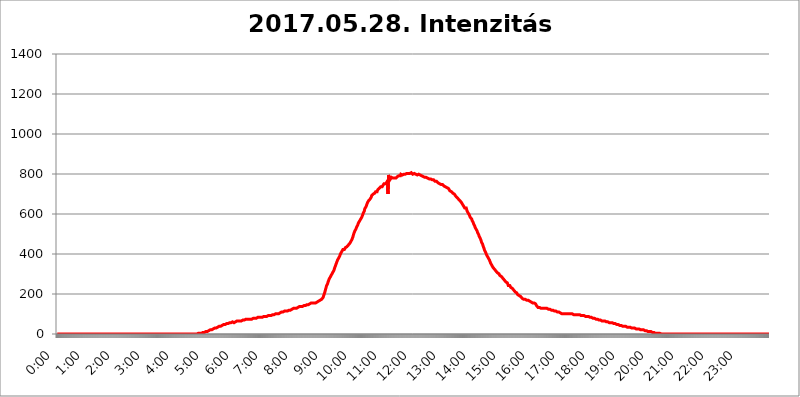
| Category | 2017.05.28. Intenzitás [W/m^2] |
|---|---|
| 0.0 | 0 |
| 0.0006944444444444445 | 0 |
| 0.001388888888888889 | 0 |
| 0.0020833333333333333 | 0 |
| 0.002777777777777778 | 0 |
| 0.003472222222222222 | 0 |
| 0.004166666666666667 | 0 |
| 0.004861111111111111 | 0 |
| 0.005555555555555556 | 0 |
| 0.0062499999999999995 | 0 |
| 0.006944444444444444 | 0 |
| 0.007638888888888889 | 0 |
| 0.008333333333333333 | 0 |
| 0.009027777777777779 | 0 |
| 0.009722222222222222 | 0 |
| 0.010416666666666666 | 0 |
| 0.011111111111111112 | 0 |
| 0.011805555555555555 | 0 |
| 0.012499999999999999 | 0 |
| 0.013194444444444444 | 0 |
| 0.013888888888888888 | 0 |
| 0.014583333333333332 | 0 |
| 0.015277777777777777 | 0 |
| 0.015972222222222224 | 0 |
| 0.016666666666666666 | 0 |
| 0.017361111111111112 | 0 |
| 0.018055555555555557 | 0 |
| 0.01875 | 0 |
| 0.019444444444444445 | 0 |
| 0.02013888888888889 | 0 |
| 0.020833333333333332 | 0 |
| 0.02152777777777778 | 0 |
| 0.022222222222222223 | 0 |
| 0.02291666666666667 | 0 |
| 0.02361111111111111 | 0 |
| 0.024305555555555556 | 0 |
| 0.024999999999999998 | 0 |
| 0.025694444444444447 | 0 |
| 0.02638888888888889 | 0 |
| 0.027083333333333334 | 0 |
| 0.027777777777777776 | 0 |
| 0.02847222222222222 | 0 |
| 0.029166666666666664 | 0 |
| 0.029861111111111113 | 0 |
| 0.030555555555555555 | 0 |
| 0.03125 | 0 |
| 0.03194444444444445 | 0 |
| 0.03263888888888889 | 0 |
| 0.03333333333333333 | 0 |
| 0.034027777777777775 | 0 |
| 0.034722222222222224 | 0 |
| 0.035416666666666666 | 0 |
| 0.036111111111111115 | 0 |
| 0.03680555555555556 | 0 |
| 0.0375 | 0 |
| 0.03819444444444444 | 0 |
| 0.03888888888888889 | 0 |
| 0.03958333333333333 | 0 |
| 0.04027777777777778 | 0 |
| 0.04097222222222222 | 0 |
| 0.041666666666666664 | 0 |
| 0.042361111111111106 | 0 |
| 0.04305555555555556 | 0 |
| 0.043750000000000004 | 0 |
| 0.044444444444444446 | 0 |
| 0.04513888888888889 | 0 |
| 0.04583333333333334 | 0 |
| 0.04652777777777778 | 0 |
| 0.04722222222222222 | 0 |
| 0.04791666666666666 | 0 |
| 0.04861111111111111 | 0 |
| 0.049305555555555554 | 0 |
| 0.049999999999999996 | 0 |
| 0.05069444444444445 | 0 |
| 0.051388888888888894 | 0 |
| 0.052083333333333336 | 0 |
| 0.05277777777777778 | 0 |
| 0.05347222222222222 | 0 |
| 0.05416666666666667 | 0 |
| 0.05486111111111111 | 0 |
| 0.05555555555555555 | 0 |
| 0.05625 | 0 |
| 0.05694444444444444 | 0 |
| 0.057638888888888885 | 0 |
| 0.05833333333333333 | 0 |
| 0.05902777777777778 | 0 |
| 0.059722222222222225 | 0 |
| 0.06041666666666667 | 0 |
| 0.061111111111111116 | 0 |
| 0.06180555555555556 | 0 |
| 0.0625 | 0 |
| 0.06319444444444444 | 0 |
| 0.06388888888888888 | 0 |
| 0.06458333333333334 | 0 |
| 0.06527777777777778 | 0 |
| 0.06597222222222222 | 0 |
| 0.06666666666666667 | 0 |
| 0.06736111111111111 | 0 |
| 0.06805555555555555 | 0 |
| 0.06874999999999999 | 0 |
| 0.06944444444444443 | 0 |
| 0.07013888888888889 | 0 |
| 0.07083333333333333 | 0 |
| 0.07152777777777779 | 0 |
| 0.07222222222222223 | 0 |
| 0.07291666666666667 | 0 |
| 0.07361111111111111 | 0 |
| 0.07430555555555556 | 0 |
| 0.075 | 0 |
| 0.07569444444444444 | 0 |
| 0.0763888888888889 | 0 |
| 0.07708333333333334 | 0 |
| 0.07777777777777778 | 0 |
| 0.07847222222222222 | 0 |
| 0.07916666666666666 | 0 |
| 0.0798611111111111 | 0 |
| 0.08055555555555556 | 0 |
| 0.08125 | 0 |
| 0.08194444444444444 | 0 |
| 0.08263888888888889 | 0 |
| 0.08333333333333333 | 0 |
| 0.08402777777777777 | 0 |
| 0.08472222222222221 | 0 |
| 0.08541666666666665 | 0 |
| 0.08611111111111112 | 0 |
| 0.08680555555555557 | 0 |
| 0.08750000000000001 | 0 |
| 0.08819444444444445 | 0 |
| 0.08888888888888889 | 0 |
| 0.08958333333333333 | 0 |
| 0.09027777777777778 | 0 |
| 0.09097222222222222 | 0 |
| 0.09166666666666667 | 0 |
| 0.09236111111111112 | 0 |
| 0.09305555555555556 | 0 |
| 0.09375 | 0 |
| 0.09444444444444444 | 0 |
| 0.09513888888888888 | 0 |
| 0.09583333333333333 | 0 |
| 0.09652777777777777 | 0 |
| 0.09722222222222222 | 0 |
| 0.09791666666666667 | 0 |
| 0.09861111111111111 | 0 |
| 0.09930555555555555 | 0 |
| 0.09999999999999999 | 0 |
| 0.10069444444444443 | 0 |
| 0.1013888888888889 | 0 |
| 0.10208333333333335 | 0 |
| 0.10277777777777779 | 0 |
| 0.10347222222222223 | 0 |
| 0.10416666666666667 | 0 |
| 0.10486111111111111 | 0 |
| 0.10555555555555556 | 0 |
| 0.10625 | 0 |
| 0.10694444444444444 | 0 |
| 0.1076388888888889 | 0 |
| 0.10833333333333334 | 0 |
| 0.10902777777777778 | 0 |
| 0.10972222222222222 | 0 |
| 0.1111111111111111 | 0 |
| 0.11180555555555556 | 0 |
| 0.11180555555555556 | 0 |
| 0.1125 | 0 |
| 0.11319444444444444 | 0 |
| 0.11388888888888889 | 0 |
| 0.11458333333333333 | 0 |
| 0.11527777777777777 | 0 |
| 0.11597222222222221 | 0 |
| 0.11666666666666665 | 0 |
| 0.1173611111111111 | 0 |
| 0.11805555555555557 | 0 |
| 0.11944444444444445 | 0 |
| 0.12013888888888889 | 0 |
| 0.12083333333333333 | 0 |
| 0.12152777777777778 | 0 |
| 0.12222222222222223 | 0 |
| 0.12291666666666667 | 0 |
| 0.12291666666666667 | 0 |
| 0.12361111111111112 | 0 |
| 0.12430555555555556 | 0 |
| 0.125 | 0 |
| 0.12569444444444444 | 0 |
| 0.12638888888888888 | 0 |
| 0.12708333333333333 | 0 |
| 0.16875 | 0 |
| 0.12847222222222224 | 0 |
| 0.12916666666666668 | 0 |
| 0.12986111111111112 | 0 |
| 0.13055555555555556 | 0 |
| 0.13125 | 0 |
| 0.13194444444444445 | 0 |
| 0.1326388888888889 | 0 |
| 0.13333333333333333 | 0 |
| 0.13402777777777777 | 0 |
| 0.13402777777777777 | 0 |
| 0.13472222222222222 | 0 |
| 0.13541666666666666 | 0 |
| 0.1361111111111111 | 0 |
| 0.13749999999999998 | 0 |
| 0.13819444444444443 | 0 |
| 0.1388888888888889 | 0 |
| 0.13958333333333334 | 0 |
| 0.14027777777777778 | 0 |
| 0.14097222222222222 | 0 |
| 0.14166666666666666 | 0 |
| 0.1423611111111111 | 0 |
| 0.14305555555555557 | 0 |
| 0.14375000000000002 | 0 |
| 0.14444444444444446 | 0 |
| 0.1451388888888889 | 0 |
| 0.1451388888888889 | 0 |
| 0.14652777777777778 | 0 |
| 0.14722222222222223 | 0 |
| 0.14791666666666667 | 0 |
| 0.1486111111111111 | 0 |
| 0.14930555555555555 | 0 |
| 0.15 | 0 |
| 0.15069444444444444 | 0 |
| 0.15138888888888888 | 0 |
| 0.15208333333333332 | 0 |
| 0.15277777777777776 | 0 |
| 0.15347222222222223 | 0 |
| 0.15416666666666667 | 0 |
| 0.15486111111111112 | 0 |
| 0.15555555555555556 | 0 |
| 0.15625 | 0 |
| 0.15694444444444444 | 0 |
| 0.15763888888888888 | 0 |
| 0.15833333333333333 | 0 |
| 0.15902777777777777 | 0 |
| 0.15972222222222224 | 0 |
| 0.16041666666666668 | 0 |
| 0.16111111111111112 | 0 |
| 0.16180555555555556 | 0 |
| 0.1625 | 0 |
| 0.16319444444444445 | 0 |
| 0.1638888888888889 | 0 |
| 0.16458333333333333 | 0 |
| 0.16527777777777777 | 0 |
| 0.16597222222222222 | 0 |
| 0.16666666666666666 | 0 |
| 0.1673611111111111 | 0 |
| 0.16805555555555554 | 0 |
| 0.16874999999999998 | 0 |
| 0.16944444444444443 | 0 |
| 0.17013888888888887 | 0 |
| 0.1708333333333333 | 0 |
| 0.17152777777777775 | 0 |
| 0.17222222222222225 | 0 |
| 0.1729166666666667 | 0 |
| 0.17361111111111113 | 0 |
| 0.17430555555555557 | 0 |
| 0.17500000000000002 | 0 |
| 0.17569444444444446 | 0 |
| 0.1763888888888889 | 0 |
| 0.17708333333333334 | 0 |
| 0.17777777777777778 | 0 |
| 0.17847222222222223 | 0 |
| 0.17916666666666667 | 0 |
| 0.1798611111111111 | 0 |
| 0.18055555555555555 | 0 |
| 0.18125 | 0 |
| 0.18194444444444444 | 0 |
| 0.1826388888888889 | 0 |
| 0.18333333333333335 | 0 |
| 0.1840277777777778 | 0 |
| 0.18472222222222223 | 0 |
| 0.18541666666666667 | 0 |
| 0.18611111111111112 | 0 |
| 0.18680555555555556 | 0 |
| 0.1875 | 0 |
| 0.18819444444444444 | 0 |
| 0.18888888888888888 | 0 |
| 0.18958333333333333 | 0 |
| 0.19027777777777777 | 0 |
| 0.1909722222222222 | 0 |
| 0.19166666666666665 | 0 |
| 0.19236111111111112 | 0 |
| 0.19305555555555554 | 0 |
| 0.19375 | 0 |
| 0.19444444444444445 | 0 |
| 0.1951388888888889 | 0 |
| 0.19583333333333333 | 0 |
| 0.19652777777777777 | 0 |
| 0.19722222222222222 | 3.525 |
| 0.19791666666666666 | 3.525 |
| 0.1986111111111111 | 3.525 |
| 0.19930555555555554 | 3.525 |
| 0.19999999999999998 | 3.525 |
| 0.20069444444444443 | 3.525 |
| 0.20138888888888887 | 3.525 |
| 0.2020833333333333 | 3.525 |
| 0.2027777777777778 | 3.525 |
| 0.2034722222222222 | 7.887 |
| 0.2041666666666667 | 7.887 |
| 0.20486111111111113 | 7.887 |
| 0.20555555555555557 | 7.887 |
| 0.20625000000000002 | 7.887 |
| 0.20694444444444446 | 7.887 |
| 0.2076388888888889 | 7.887 |
| 0.20833333333333334 | 12.257 |
| 0.20902777777777778 | 12.257 |
| 0.20972222222222223 | 12.257 |
| 0.21041666666666667 | 12.257 |
| 0.2111111111111111 | 12.257 |
| 0.21180555555555555 | 16.636 |
| 0.2125 | 16.636 |
| 0.21319444444444444 | 16.636 |
| 0.2138888888888889 | 21.024 |
| 0.21458333333333335 | 21.024 |
| 0.2152777777777778 | 21.024 |
| 0.21597222222222223 | 21.024 |
| 0.21666666666666667 | 21.024 |
| 0.21736111111111112 | 25.419 |
| 0.21805555555555556 | 25.419 |
| 0.21875 | 25.419 |
| 0.21944444444444444 | 25.419 |
| 0.22013888888888888 | 29.823 |
| 0.22083333333333333 | 29.823 |
| 0.22152777777777777 | 29.823 |
| 0.2222222222222222 | 29.823 |
| 0.22291666666666665 | 29.823 |
| 0.2236111111111111 | 29.823 |
| 0.22430555555555556 | 34.234 |
| 0.225 | 34.234 |
| 0.22569444444444445 | 34.234 |
| 0.2263888888888889 | 38.653 |
| 0.22708333333333333 | 38.653 |
| 0.22777777777777777 | 38.653 |
| 0.22847222222222222 | 38.653 |
| 0.22916666666666666 | 38.653 |
| 0.2298611111111111 | 38.653 |
| 0.23055555555555554 | 43.079 |
| 0.23124999999999998 | 43.079 |
| 0.23194444444444443 | 43.079 |
| 0.23263888888888887 | 43.079 |
| 0.2333333333333333 | 47.511 |
| 0.2340277777777778 | 47.511 |
| 0.2347222222222222 | 47.511 |
| 0.2354166666666667 | 47.511 |
| 0.23611111111111113 | 47.511 |
| 0.23680555555555557 | 51.951 |
| 0.23750000000000002 | 51.951 |
| 0.23819444444444446 | 51.951 |
| 0.2388888888888889 | 51.951 |
| 0.23958333333333334 | 51.951 |
| 0.24027777777777778 | 56.398 |
| 0.24097222222222223 | 56.398 |
| 0.24166666666666667 | 56.398 |
| 0.2423611111111111 | 56.398 |
| 0.24305555555555555 | 56.398 |
| 0.24375 | 56.398 |
| 0.24444444444444446 | 56.398 |
| 0.24513888888888888 | 56.398 |
| 0.24583333333333335 | 60.85 |
| 0.2465277777777778 | 56.398 |
| 0.24722222222222223 | 60.85 |
| 0.24791666666666667 | 56.398 |
| 0.24861111111111112 | 60.85 |
| 0.24930555555555556 | 60.85 |
| 0.25 | 60.85 |
| 0.25069444444444444 | 60.85 |
| 0.2513888888888889 | 60.85 |
| 0.2520833333333333 | 65.31 |
| 0.25277777777777777 | 65.31 |
| 0.2534722222222222 | 65.31 |
| 0.25416666666666665 | 65.31 |
| 0.2548611111111111 | 65.31 |
| 0.2555555555555556 | 65.31 |
| 0.25625000000000003 | 65.31 |
| 0.2569444444444445 | 65.31 |
| 0.2576388888888889 | 65.31 |
| 0.25833333333333336 | 65.31 |
| 0.2590277777777778 | 65.31 |
| 0.25972222222222224 | 69.775 |
| 0.2604166666666667 | 69.775 |
| 0.2611111111111111 | 69.775 |
| 0.26180555555555557 | 69.775 |
| 0.2625 | 69.775 |
| 0.26319444444444445 | 69.775 |
| 0.2638888888888889 | 69.775 |
| 0.26458333333333334 | 74.246 |
| 0.2652777777777778 | 74.246 |
| 0.2659722222222222 | 74.246 |
| 0.26666666666666666 | 74.246 |
| 0.2673611111111111 | 74.246 |
| 0.26805555555555555 | 74.246 |
| 0.26875 | 74.246 |
| 0.26944444444444443 | 74.246 |
| 0.2701388888888889 | 74.246 |
| 0.2708333333333333 | 74.246 |
| 0.27152777777777776 | 74.246 |
| 0.2722222222222222 | 78.722 |
| 0.27291666666666664 | 74.246 |
| 0.2736111111111111 | 78.722 |
| 0.2743055555555555 | 78.722 |
| 0.27499999999999997 | 78.722 |
| 0.27569444444444446 | 78.722 |
| 0.27638888888888885 | 78.722 |
| 0.27708333333333335 | 78.722 |
| 0.2777777777777778 | 78.722 |
| 0.27847222222222223 | 78.722 |
| 0.2791666666666667 | 78.722 |
| 0.2798611111111111 | 78.722 |
| 0.28055555555555556 | 83.205 |
| 0.28125 | 83.205 |
| 0.28194444444444444 | 83.205 |
| 0.2826388888888889 | 83.205 |
| 0.2833333333333333 | 83.205 |
| 0.28402777777777777 | 83.205 |
| 0.2847222222222222 | 83.205 |
| 0.28541666666666665 | 83.205 |
| 0.28611111111111115 | 83.205 |
| 0.28680555555555554 | 83.205 |
| 0.28750000000000003 | 83.205 |
| 0.2881944444444445 | 87.692 |
| 0.2888888888888889 | 87.692 |
| 0.28958333333333336 | 87.692 |
| 0.2902777777777778 | 87.692 |
| 0.29097222222222224 | 87.692 |
| 0.2916666666666667 | 87.692 |
| 0.2923611111111111 | 87.692 |
| 0.29305555555555557 | 92.184 |
| 0.29375 | 87.692 |
| 0.29444444444444445 | 92.184 |
| 0.2951388888888889 | 92.184 |
| 0.29583333333333334 | 92.184 |
| 0.2965277777777778 | 92.184 |
| 0.2972222222222222 | 92.184 |
| 0.29791666666666666 | 92.184 |
| 0.2986111111111111 | 92.184 |
| 0.29930555555555555 | 92.184 |
| 0.3 | 92.184 |
| 0.30069444444444443 | 96.682 |
| 0.3013888888888889 | 96.682 |
| 0.3020833333333333 | 96.682 |
| 0.30277777777777776 | 96.682 |
| 0.3034722222222222 | 96.682 |
| 0.30416666666666664 | 96.682 |
| 0.3048611111111111 | 96.682 |
| 0.3055555555555555 | 96.682 |
| 0.30624999999999997 | 101.184 |
| 0.3069444444444444 | 101.184 |
| 0.3076388888888889 | 101.184 |
| 0.30833333333333335 | 101.184 |
| 0.3090277777777778 | 101.184 |
| 0.30972222222222223 | 101.184 |
| 0.3104166666666667 | 101.184 |
| 0.3111111111111111 | 101.184 |
| 0.31180555555555556 | 101.184 |
| 0.3125 | 105.69 |
| 0.31319444444444444 | 105.69 |
| 0.3138888888888889 | 105.69 |
| 0.3145833333333333 | 110.201 |
| 0.31527777777777777 | 110.201 |
| 0.3159722222222222 | 110.201 |
| 0.31666666666666665 | 110.201 |
| 0.31736111111111115 | 110.201 |
| 0.31805555555555554 | 110.201 |
| 0.31875000000000003 | 114.716 |
| 0.3194444444444445 | 114.716 |
| 0.3201388888888889 | 114.716 |
| 0.32083333333333336 | 114.716 |
| 0.3215277777777778 | 114.716 |
| 0.32222222222222224 | 114.716 |
| 0.3229166666666667 | 114.716 |
| 0.3236111111111111 | 119.235 |
| 0.32430555555555557 | 119.235 |
| 0.325 | 119.235 |
| 0.32569444444444445 | 119.235 |
| 0.3263888888888889 | 119.235 |
| 0.32708333333333334 | 119.235 |
| 0.3277777777777778 | 119.235 |
| 0.3284722222222222 | 123.758 |
| 0.32916666666666666 | 123.758 |
| 0.3298611111111111 | 123.758 |
| 0.33055555555555555 | 123.758 |
| 0.33125 | 128.284 |
| 0.33194444444444443 | 128.284 |
| 0.3326388888888889 | 128.284 |
| 0.3333333333333333 | 128.284 |
| 0.3340277777777778 | 128.284 |
| 0.3347222222222222 | 128.284 |
| 0.3354166666666667 | 128.284 |
| 0.3361111111111111 | 132.814 |
| 0.3368055555555556 | 132.814 |
| 0.33749999999999997 | 132.814 |
| 0.33819444444444446 | 132.814 |
| 0.33888888888888885 | 132.814 |
| 0.33958333333333335 | 137.347 |
| 0.34027777777777773 | 137.347 |
| 0.34097222222222223 | 137.347 |
| 0.3416666666666666 | 137.347 |
| 0.3423611111111111 | 137.347 |
| 0.3430555555555555 | 137.347 |
| 0.34375 | 137.347 |
| 0.3444444444444445 | 137.347 |
| 0.3451388888888889 | 141.884 |
| 0.3458333333333334 | 141.884 |
| 0.34652777777777777 | 141.884 |
| 0.34722222222222227 | 141.884 |
| 0.34791666666666665 | 141.884 |
| 0.34861111111111115 | 141.884 |
| 0.34930555555555554 | 146.423 |
| 0.35000000000000003 | 146.423 |
| 0.3506944444444444 | 146.423 |
| 0.3513888888888889 | 146.423 |
| 0.3520833333333333 | 146.423 |
| 0.3527777777777778 | 146.423 |
| 0.3534722222222222 | 150.964 |
| 0.3541666666666667 | 150.964 |
| 0.3548611111111111 | 150.964 |
| 0.35555555555555557 | 150.964 |
| 0.35625 | 155.509 |
| 0.35694444444444445 | 150.964 |
| 0.3576388888888889 | 155.509 |
| 0.35833333333333334 | 155.509 |
| 0.3590277777777778 | 155.509 |
| 0.3597222222222222 | 155.509 |
| 0.36041666666666666 | 155.509 |
| 0.3611111111111111 | 155.509 |
| 0.36180555555555555 | 155.509 |
| 0.3625 | 155.509 |
| 0.36319444444444443 | 160.056 |
| 0.3638888888888889 | 160.056 |
| 0.3645833333333333 | 160.056 |
| 0.3652777777777778 | 164.605 |
| 0.3659722222222222 | 164.605 |
| 0.3666666666666667 | 164.605 |
| 0.3673611111111111 | 164.605 |
| 0.3680555555555556 | 164.605 |
| 0.36874999999999997 | 169.156 |
| 0.36944444444444446 | 169.156 |
| 0.37013888888888885 | 173.709 |
| 0.37083333333333335 | 173.709 |
| 0.37152777777777773 | 173.709 |
| 0.37222222222222223 | 178.264 |
| 0.3729166666666666 | 182.82 |
| 0.3736111111111111 | 191.937 |
| 0.3743055555555555 | 196.497 |
| 0.375 | 205.62 |
| 0.3756944444444445 | 214.746 |
| 0.3763888888888889 | 223.873 |
| 0.3770833333333334 | 228.436 |
| 0.37777777777777777 | 242.127 |
| 0.37847222222222227 | 246.689 |
| 0.37916666666666665 | 251.251 |
| 0.37986111111111115 | 260.373 |
| 0.38055555555555554 | 264.932 |
| 0.38125000000000003 | 274.047 |
| 0.3819444444444444 | 278.603 |
| 0.3826388888888889 | 283.156 |
| 0.3833333333333333 | 287.709 |
| 0.3840277777777778 | 292.259 |
| 0.3847222222222222 | 296.808 |
| 0.3854166666666667 | 301.354 |
| 0.3861111111111111 | 305.898 |
| 0.38680555555555557 | 310.44 |
| 0.3875 | 314.98 |
| 0.38819444444444445 | 319.517 |
| 0.3888888888888889 | 328.584 |
| 0.38958333333333334 | 333.113 |
| 0.3902777777777778 | 342.162 |
| 0.3909722222222222 | 346.682 |
| 0.39166666666666666 | 355.712 |
| 0.3923611111111111 | 360.221 |
| 0.39305555555555555 | 369.23 |
| 0.39375 | 373.729 |
| 0.39444444444444443 | 378.224 |
| 0.3951388888888889 | 382.715 |
| 0.3958333333333333 | 387.202 |
| 0.3965277777777778 | 387.202 |
| 0.3972222222222222 | 400.638 |
| 0.3979166666666667 | 405.108 |
| 0.3986111111111111 | 409.574 |
| 0.3993055555555556 | 414.035 |
| 0.39999999999999997 | 414.035 |
| 0.40069444444444446 | 422.943 |
| 0.40138888888888885 | 422.943 |
| 0.40208333333333335 | 427.39 |
| 0.40277777777777773 | 422.943 |
| 0.40347222222222223 | 427.39 |
| 0.4041666666666666 | 431.833 |
| 0.4048611111111111 | 431.833 |
| 0.4055555555555555 | 431.833 |
| 0.40625 | 436.27 |
| 0.4069444444444445 | 440.702 |
| 0.4076388888888889 | 440.702 |
| 0.4083333333333334 | 445.129 |
| 0.40902777777777777 | 445.129 |
| 0.40972222222222227 | 449.551 |
| 0.41041666666666665 | 453.968 |
| 0.41111111111111115 | 458.38 |
| 0.41180555555555554 | 462.786 |
| 0.41250000000000003 | 467.187 |
| 0.4131944444444444 | 471.582 |
| 0.4138888888888889 | 475.972 |
| 0.4145833333333333 | 484.735 |
| 0.4152777777777778 | 493.475 |
| 0.4159722222222222 | 502.192 |
| 0.4166666666666667 | 506.542 |
| 0.4173611111111111 | 515.223 |
| 0.41805555555555557 | 515.223 |
| 0.41875 | 523.88 |
| 0.41944444444444445 | 523.88 |
| 0.4201388888888889 | 536.82 |
| 0.42083333333333334 | 536.82 |
| 0.4215277777777778 | 545.416 |
| 0.4222222222222222 | 553.986 |
| 0.42291666666666666 | 558.261 |
| 0.4236111111111111 | 553.986 |
| 0.42430555555555555 | 566.793 |
| 0.425 | 571.049 |
| 0.42569444444444443 | 575.299 |
| 0.4263888888888889 | 575.299 |
| 0.4270833333333333 | 583.779 |
| 0.4277777777777778 | 588.009 |
| 0.4284722222222222 | 596.45 |
| 0.4291666666666667 | 604.864 |
| 0.4298611111111111 | 609.062 |
| 0.4305555555555556 | 613.252 |
| 0.43124999999999997 | 625.784 |
| 0.43194444444444446 | 625.784 |
| 0.43263888888888885 | 629.948 |
| 0.43333333333333335 | 638.256 |
| 0.43402777777777773 | 646.537 |
| 0.43472222222222223 | 650.667 |
| 0.4354166666666666 | 658.909 |
| 0.4361111111111111 | 658.909 |
| 0.4368055555555555 | 667.123 |
| 0.4375 | 671.22 |
| 0.4381944444444445 | 671.22 |
| 0.4388888888888889 | 675.311 |
| 0.4395833333333334 | 679.395 |
| 0.44027777777777777 | 683.473 |
| 0.44097222222222227 | 691.608 |
| 0.44166666666666665 | 691.608 |
| 0.44236111111111115 | 695.666 |
| 0.44305555555555554 | 699.717 |
| 0.44375000000000003 | 703.762 |
| 0.4444444444444444 | 703.762 |
| 0.4451388888888889 | 703.762 |
| 0.4458333333333333 | 707.8 |
| 0.4465277777777778 | 711.832 |
| 0.4472222222222222 | 711.832 |
| 0.4479166666666667 | 711.832 |
| 0.4486111111111111 | 711.832 |
| 0.44930555555555557 | 719.877 |
| 0.45 | 723.889 |
| 0.45069444444444445 | 723.889 |
| 0.4513888888888889 | 727.896 |
| 0.45208333333333334 | 727.896 |
| 0.4527777777777778 | 731.896 |
| 0.4534722222222222 | 735.89 |
| 0.45416666666666666 | 735.89 |
| 0.4548611111111111 | 739.877 |
| 0.45555555555555555 | 735.89 |
| 0.45625 | 739.877 |
| 0.45694444444444443 | 743.859 |
| 0.4576388888888889 | 747.834 |
| 0.4583333333333333 | 751.803 |
| 0.4590277777777778 | 755.766 |
| 0.4597222222222222 | 755.766 |
| 0.4604166666666667 | 751.803 |
| 0.4611111111111111 | 755.766 |
| 0.4618055555555556 | 747.834 |
| 0.46249999999999997 | 759.723 |
| 0.46319444444444446 | 767.62 |
| 0.46388888888888885 | 699.717 |
| 0.46458333333333335 | 795.074 |
| 0.46527777777777773 | 787.258 |
| 0.46597222222222223 | 779.42 |
| 0.4666666666666666 | 771.559 |
| 0.4673611111111111 | 775.492 |
| 0.4680555555555555 | 775.492 |
| 0.46875 | 783.342 |
| 0.4694444444444445 | 787.258 |
| 0.4701388888888889 | 783.342 |
| 0.4708333333333334 | 779.42 |
| 0.47152777777777777 | 779.42 |
| 0.47222222222222227 | 779.42 |
| 0.47291666666666665 | 779.42 |
| 0.47361111111111115 | 779.42 |
| 0.47430555555555554 | 779.42 |
| 0.47500000000000003 | 779.42 |
| 0.4756944444444444 | 783.342 |
| 0.4763888888888889 | 783.342 |
| 0.4770833333333333 | 787.258 |
| 0.4777777777777778 | 787.258 |
| 0.4784722222222222 | 787.258 |
| 0.4791666666666667 | 791.169 |
| 0.4798611111111111 | 791.169 |
| 0.48055555555555557 | 791.169 |
| 0.48125 | 791.169 |
| 0.48194444444444445 | 798.974 |
| 0.4826388888888889 | 798.974 |
| 0.48333333333333334 | 795.074 |
| 0.4840277777777778 | 795.074 |
| 0.4847222222222222 | 795.074 |
| 0.48541666666666666 | 795.074 |
| 0.4861111111111111 | 798.974 |
| 0.48680555555555555 | 798.974 |
| 0.4875 | 798.974 |
| 0.48819444444444443 | 798.974 |
| 0.4888888888888889 | 798.974 |
| 0.4895833333333333 | 802.868 |
| 0.4902777777777778 | 802.868 |
| 0.4909722222222222 | 802.868 |
| 0.4916666666666667 | 802.868 |
| 0.4923611111111111 | 802.868 |
| 0.4930555555555556 | 802.868 |
| 0.49374999999999997 | 806.757 |
| 0.49444444444444446 | 802.868 |
| 0.49513888888888885 | 802.868 |
| 0.49583333333333335 | 798.974 |
| 0.49652777777777773 | 806.757 |
| 0.49722222222222223 | 806.757 |
| 0.4979166666666666 | 802.868 |
| 0.4986111111111111 | 798.974 |
| 0.4993055555555555 | 798.974 |
| 0.5 | 798.974 |
| 0.5006944444444444 | 802.868 |
| 0.5013888888888889 | 798.974 |
| 0.5020833333333333 | 798.974 |
| 0.5027777777777778 | 798.974 |
| 0.5034722222222222 | 798.974 |
| 0.5041666666666667 | 798.974 |
| 0.5048611111111111 | 795.074 |
| 0.5055555555555555 | 795.074 |
| 0.50625 | 795.074 |
| 0.5069444444444444 | 798.974 |
| 0.5076388888888889 | 795.074 |
| 0.5083333333333333 | 795.074 |
| 0.5090277777777777 | 795.074 |
| 0.5097222222222222 | 795.074 |
| 0.5104166666666666 | 791.169 |
| 0.5111111111111112 | 791.169 |
| 0.5118055555555555 | 787.258 |
| 0.5125000000000001 | 787.258 |
| 0.5131944444444444 | 787.258 |
| 0.513888888888889 | 787.258 |
| 0.5145833333333333 | 787.258 |
| 0.5152777777777778 | 783.342 |
| 0.5159722222222222 | 783.342 |
| 0.5166666666666667 | 783.342 |
| 0.517361111111111 | 783.342 |
| 0.5180555555555556 | 783.342 |
| 0.5187499999999999 | 779.42 |
| 0.5194444444444445 | 779.42 |
| 0.5201388888888888 | 779.42 |
| 0.5208333333333334 | 779.42 |
| 0.5215277777777778 | 775.492 |
| 0.5222222222222223 | 775.492 |
| 0.5229166666666667 | 775.492 |
| 0.5236111111111111 | 775.492 |
| 0.5243055555555556 | 775.492 |
| 0.525 | 775.492 |
| 0.5256944444444445 | 771.559 |
| 0.5263888888888889 | 771.559 |
| 0.5270833333333333 | 767.62 |
| 0.5277777777777778 | 771.559 |
| 0.5284722222222222 | 767.62 |
| 0.5291666666666667 | 767.62 |
| 0.5298611111111111 | 763.674 |
| 0.5305555555555556 | 763.674 |
| 0.53125 | 763.674 |
| 0.5319444444444444 | 763.674 |
| 0.5326388888888889 | 759.723 |
| 0.5333333333333333 | 759.723 |
| 0.5340277777777778 | 755.766 |
| 0.5347222222222222 | 755.766 |
| 0.5354166666666667 | 751.803 |
| 0.5361111111111111 | 751.803 |
| 0.5368055555555555 | 751.803 |
| 0.5375 | 747.834 |
| 0.5381944444444444 | 747.834 |
| 0.5388888888888889 | 747.834 |
| 0.5395833333333333 | 747.834 |
| 0.5402777777777777 | 747.834 |
| 0.5409722222222222 | 743.859 |
| 0.5416666666666666 | 743.859 |
| 0.5423611111111112 | 739.877 |
| 0.5430555555555555 | 739.877 |
| 0.5437500000000001 | 735.89 |
| 0.5444444444444444 | 735.89 |
| 0.545138888888889 | 731.896 |
| 0.5458333333333333 | 731.896 |
| 0.5465277777777778 | 731.896 |
| 0.5472222222222222 | 731.896 |
| 0.5479166666666667 | 727.896 |
| 0.548611111111111 | 727.896 |
| 0.5493055555555556 | 723.889 |
| 0.5499999999999999 | 723.889 |
| 0.5506944444444445 | 715.858 |
| 0.5513888888888888 | 715.858 |
| 0.5520833333333334 | 715.858 |
| 0.5527777777777778 | 711.832 |
| 0.5534722222222223 | 707.8 |
| 0.5541666666666667 | 707.8 |
| 0.5548611111111111 | 703.762 |
| 0.5555555555555556 | 703.762 |
| 0.55625 | 699.717 |
| 0.5569444444444445 | 699.717 |
| 0.5576388888888889 | 695.666 |
| 0.5583333333333333 | 691.608 |
| 0.5590277777777778 | 687.544 |
| 0.5597222222222222 | 687.544 |
| 0.5604166666666667 | 683.473 |
| 0.5611111111111111 | 683.473 |
| 0.5618055555555556 | 683.473 |
| 0.5625 | 675.311 |
| 0.5631944444444444 | 675.311 |
| 0.5638888888888889 | 671.22 |
| 0.5645833333333333 | 667.123 |
| 0.5652777777777778 | 667.123 |
| 0.5659722222222222 | 663.019 |
| 0.5666666666666667 | 658.909 |
| 0.5673611111111111 | 654.791 |
| 0.5680555555555555 | 654.791 |
| 0.56875 | 646.537 |
| 0.5694444444444444 | 646.537 |
| 0.5701388888888889 | 638.256 |
| 0.5708333333333333 | 638.256 |
| 0.5715277777777777 | 629.948 |
| 0.5722222222222222 | 634.105 |
| 0.5729166666666666 | 629.948 |
| 0.5736111111111112 | 629.948 |
| 0.5743055555555555 | 625.784 |
| 0.5750000000000001 | 613.252 |
| 0.5756944444444444 | 609.062 |
| 0.576388888888889 | 604.864 |
| 0.5770833333333333 | 600.661 |
| 0.5777777777777778 | 596.45 |
| 0.5784722222222222 | 592.233 |
| 0.5791666666666667 | 583.779 |
| 0.579861111111111 | 583.779 |
| 0.5805555555555556 | 579.542 |
| 0.5812499999999999 | 575.299 |
| 0.5819444444444445 | 566.793 |
| 0.5826388888888888 | 562.53 |
| 0.5833333333333334 | 558.261 |
| 0.5840277777777778 | 549.704 |
| 0.5847222222222223 | 545.416 |
| 0.5854166666666667 | 541.121 |
| 0.5861111111111111 | 532.513 |
| 0.5868055555555556 | 532.513 |
| 0.5875 | 523.88 |
| 0.5881944444444445 | 519.555 |
| 0.5888888888888889 | 515.223 |
| 0.5895833333333333 | 506.542 |
| 0.5902777777777778 | 502.192 |
| 0.5909722222222222 | 497.836 |
| 0.5916666666666667 | 489.108 |
| 0.5923611111111111 | 484.735 |
| 0.5930555555555556 | 480.356 |
| 0.59375 | 475.972 |
| 0.5944444444444444 | 467.187 |
| 0.5951388888888889 | 458.38 |
| 0.5958333333333333 | 453.968 |
| 0.5965277777777778 | 449.551 |
| 0.5972222222222222 | 440.702 |
| 0.5979166666666667 | 436.27 |
| 0.5986111111111111 | 427.39 |
| 0.5993055555555555 | 418.492 |
| 0.6 | 414.035 |
| 0.6006944444444444 | 409.574 |
| 0.6013888888888889 | 405.108 |
| 0.6020833333333333 | 396.164 |
| 0.6027777777777777 | 391.685 |
| 0.6034722222222222 | 387.202 |
| 0.6041666666666666 | 382.715 |
| 0.6048611111111112 | 378.224 |
| 0.6055555555555555 | 373.729 |
| 0.6062500000000001 | 369.23 |
| 0.6069444444444444 | 364.728 |
| 0.607638888888889 | 355.712 |
| 0.6083333333333333 | 351.198 |
| 0.6090277777777778 | 346.682 |
| 0.6097222222222222 | 342.162 |
| 0.6104166666666667 | 342.162 |
| 0.611111111111111 | 333.113 |
| 0.6118055555555556 | 333.113 |
| 0.6124999999999999 | 328.584 |
| 0.6131944444444445 | 324.052 |
| 0.6138888888888888 | 319.517 |
| 0.6145833333333334 | 319.517 |
| 0.6152777777777778 | 314.98 |
| 0.6159722222222223 | 314.98 |
| 0.6166666666666667 | 310.44 |
| 0.6173611111111111 | 305.898 |
| 0.6180555555555556 | 305.898 |
| 0.61875 | 301.354 |
| 0.6194444444444445 | 301.354 |
| 0.6201388888888889 | 296.808 |
| 0.6208333333333333 | 292.259 |
| 0.6215277777777778 | 292.259 |
| 0.6222222222222222 | 292.259 |
| 0.6229166666666667 | 287.709 |
| 0.6236111111111111 | 287.709 |
| 0.6243055555555556 | 283.156 |
| 0.625 | 278.603 |
| 0.6256944444444444 | 278.603 |
| 0.6263888888888889 | 274.047 |
| 0.6270833333333333 | 269.49 |
| 0.6277777777777778 | 269.49 |
| 0.6284722222222222 | 264.932 |
| 0.6291666666666667 | 260.373 |
| 0.6298611111111111 | 260.373 |
| 0.6305555555555555 | 255.813 |
| 0.63125 | 255.813 |
| 0.6319444444444444 | 251.251 |
| 0.6326388888888889 | 242.127 |
| 0.6333333333333333 | 246.689 |
| 0.6340277777777777 | 242.127 |
| 0.6347222222222222 | 242.127 |
| 0.6354166666666666 | 237.564 |
| 0.6361111111111112 | 233 |
| 0.6368055555555555 | 228.436 |
| 0.6375000000000001 | 228.436 |
| 0.6381944444444444 | 228.436 |
| 0.638888888888889 | 223.873 |
| 0.6395833333333333 | 223.873 |
| 0.6402777777777778 | 219.309 |
| 0.6409722222222222 | 214.746 |
| 0.6416666666666667 | 214.746 |
| 0.642361111111111 | 210.182 |
| 0.6430555555555556 | 210.182 |
| 0.6437499999999999 | 210.182 |
| 0.6444444444444445 | 205.62 |
| 0.6451388888888888 | 201.058 |
| 0.6458333333333334 | 196.497 |
| 0.6465277777777778 | 196.497 |
| 0.6472222222222223 | 191.937 |
| 0.6479166666666667 | 191.937 |
| 0.6486111111111111 | 191.937 |
| 0.6493055555555556 | 187.378 |
| 0.65 | 187.378 |
| 0.6506944444444445 | 182.82 |
| 0.6513888888888889 | 182.82 |
| 0.6520833333333333 | 178.264 |
| 0.6527777777777778 | 178.264 |
| 0.6534722222222222 | 178.264 |
| 0.6541666666666667 | 173.709 |
| 0.6548611111111111 | 173.709 |
| 0.6555555555555556 | 173.709 |
| 0.65625 | 173.709 |
| 0.6569444444444444 | 173.709 |
| 0.6576388888888889 | 173.709 |
| 0.6583333333333333 | 169.156 |
| 0.6590277777777778 | 169.156 |
| 0.6597222222222222 | 169.156 |
| 0.6604166666666667 | 169.156 |
| 0.6611111111111111 | 164.605 |
| 0.6618055555555555 | 164.605 |
| 0.6625 | 164.605 |
| 0.6631944444444444 | 160.056 |
| 0.6638888888888889 | 160.056 |
| 0.6645833333333333 | 160.056 |
| 0.6652777777777777 | 160.056 |
| 0.6659722222222222 | 160.056 |
| 0.6666666666666666 | 155.509 |
| 0.6673611111111111 | 155.509 |
| 0.6680555555555556 | 155.509 |
| 0.6687500000000001 | 155.509 |
| 0.6694444444444444 | 155.509 |
| 0.6701388888888888 | 150.964 |
| 0.6708333333333334 | 150.964 |
| 0.6715277777777778 | 146.423 |
| 0.6722222222222222 | 141.884 |
| 0.6729166666666666 | 137.347 |
| 0.6736111111111112 | 137.347 |
| 0.6743055555555556 | 132.814 |
| 0.6749999999999999 | 132.814 |
| 0.6756944444444444 | 132.814 |
| 0.6763888888888889 | 132.814 |
| 0.6770833333333334 | 132.814 |
| 0.6777777777777777 | 128.284 |
| 0.6784722222222223 | 128.284 |
| 0.6791666666666667 | 128.284 |
| 0.6798611111111111 | 128.284 |
| 0.6805555555555555 | 128.284 |
| 0.68125 | 128.284 |
| 0.6819444444444445 | 128.284 |
| 0.6826388888888889 | 128.284 |
| 0.6833333333333332 | 128.284 |
| 0.6840277777777778 | 128.284 |
| 0.6847222222222222 | 128.284 |
| 0.6854166666666667 | 128.284 |
| 0.686111111111111 | 128.284 |
| 0.6868055555555556 | 128.284 |
| 0.6875 | 128.284 |
| 0.6881944444444444 | 123.758 |
| 0.688888888888889 | 123.758 |
| 0.6895833333333333 | 123.758 |
| 0.6902777777777778 | 123.758 |
| 0.6909722222222222 | 123.758 |
| 0.6916666666666668 | 123.758 |
| 0.6923611111111111 | 123.758 |
| 0.6930555555555555 | 119.235 |
| 0.69375 | 119.235 |
| 0.6944444444444445 | 119.235 |
| 0.6951388888888889 | 119.235 |
| 0.6958333333333333 | 119.235 |
| 0.6965277777777777 | 119.235 |
| 0.6972222222222223 | 114.716 |
| 0.6979166666666666 | 114.716 |
| 0.6986111111111111 | 114.716 |
| 0.6993055555555556 | 114.716 |
| 0.7000000000000001 | 114.716 |
| 0.7006944444444444 | 110.201 |
| 0.7013888888888888 | 110.201 |
| 0.7020833333333334 | 110.201 |
| 0.7027777777777778 | 110.201 |
| 0.7034722222222222 | 110.201 |
| 0.7041666666666666 | 110.201 |
| 0.7048611111111112 | 105.69 |
| 0.7055555555555556 | 105.69 |
| 0.7062499999999999 | 105.69 |
| 0.7069444444444444 | 105.69 |
| 0.7076388888888889 | 101.184 |
| 0.7083333333333334 | 105.69 |
| 0.7090277777777777 | 101.184 |
| 0.7097222222222223 | 101.184 |
| 0.7104166666666667 | 101.184 |
| 0.7111111111111111 | 101.184 |
| 0.7118055555555555 | 101.184 |
| 0.7125 | 101.184 |
| 0.7131944444444445 | 101.184 |
| 0.7138888888888889 | 101.184 |
| 0.7145833333333332 | 101.184 |
| 0.7152777777777778 | 101.184 |
| 0.7159722222222222 | 101.184 |
| 0.7166666666666667 | 101.184 |
| 0.717361111111111 | 101.184 |
| 0.7180555555555556 | 101.184 |
| 0.71875 | 101.184 |
| 0.7194444444444444 | 101.184 |
| 0.720138888888889 | 101.184 |
| 0.7208333333333333 | 101.184 |
| 0.7215277777777778 | 101.184 |
| 0.7222222222222222 | 101.184 |
| 0.7229166666666668 | 96.682 |
| 0.7236111111111111 | 96.682 |
| 0.7243055555555555 | 96.682 |
| 0.725 | 96.682 |
| 0.7256944444444445 | 96.682 |
| 0.7263888888888889 | 96.682 |
| 0.7270833333333333 | 96.682 |
| 0.7277777777777777 | 96.682 |
| 0.7284722222222223 | 96.682 |
| 0.7291666666666666 | 96.682 |
| 0.7298611111111111 | 96.682 |
| 0.7305555555555556 | 96.682 |
| 0.7312500000000001 | 96.682 |
| 0.7319444444444444 | 96.682 |
| 0.7326388888888888 | 96.682 |
| 0.7333333333333334 | 92.184 |
| 0.7340277777777778 | 92.184 |
| 0.7347222222222222 | 92.184 |
| 0.7354166666666666 | 92.184 |
| 0.7361111111111112 | 92.184 |
| 0.7368055555555556 | 92.184 |
| 0.7374999999999999 | 92.184 |
| 0.7381944444444444 | 92.184 |
| 0.7388888888888889 | 92.184 |
| 0.7395833333333334 | 92.184 |
| 0.7402777777777777 | 87.692 |
| 0.7409722222222223 | 87.692 |
| 0.7416666666666667 | 87.692 |
| 0.7423611111111111 | 87.692 |
| 0.7430555555555555 | 87.692 |
| 0.74375 | 87.692 |
| 0.7444444444444445 | 87.692 |
| 0.7451388888888889 | 87.692 |
| 0.7458333333333332 | 83.205 |
| 0.7465277777777778 | 83.205 |
| 0.7472222222222222 | 83.205 |
| 0.7479166666666667 | 83.205 |
| 0.748611111111111 | 83.205 |
| 0.7493055555555556 | 83.205 |
| 0.75 | 83.205 |
| 0.7506944444444444 | 78.722 |
| 0.751388888888889 | 78.722 |
| 0.7520833333333333 | 78.722 |
| 0.7527777777777778 | 78.722 |
| 0.7534722222222222 | 78.722 |
| 0.7541666666666668 | 78.722 |
| 0.7548611111111111 | 74.246 |
| 0.7555555555555555 | 74.246 |
| 0.75625 | 74.246 |
| 0.7569444444444445 | 74.246 |
| 0.7576388888888889 | 74.246 |
| 0.7583333333333333 | 74.246 |
| 0.7590277777777777 | 74.246 |
| 0.7597222222222223 | 69.775 |
| 0.7604166666666666 | 69.775 |
| 0.7611111111111111 | 69.775 |
| 0.7618055555555556 | 69.775 |
| 0.7625000000000001 | 69.775 |
| 0.7631944444444444 | 65.31 |
| 0.7638888888888888 | 65.31 |
| 0.7645833333333334 | 65.31 |
| 0.7652777777777778 | 65.31 |
| 0.7659722222222222 | 65.31 |
| 0.7666666666666666 | 65.31 |
| 0.7673611111111112 | 65.31 |
| 0.7680555555555556 | 65.31 |
| 0.7687499999999999 | 65.31 |
| 0.7694444444444444 | 60.85 |
| 0.7701388888888889 | 60.85 |
| 0.7708333333333334 | 60.85 |
| 0.7715277777777777 | 60.85 |
| 0.7722222222222223 | 60.85 |
| 0.7729166666666667 | 60.85 |
| 0.7736111111111111 | 56.398 |
| 0.7743055555555555 | 56.398 |
| 0.775 | 56.398 |
| 0.7756944444444445 | 56.398 |
| 0.7763888888888889 | 56.398 |
| 0.7770833333333332 | 56.398 |
| 0.7777777777777778 | 56.398 |
| 0.7784722222222222 | 56.398 |
| 0.7791666666666667 | 51.951 |
| 0.779861111111111 | 51.951 |
| 0.7805555555555556 | 51.951 |
| 0.78125 | 51.951 |
| 0.7819444444444444 | 51.951 |
| 0.782638888888889 | 51.951 |
| 0.7833333333333333 | 47.511 |
| 0.7840277777777778 | 47.511 |
| 0.7847222222222222 | 47.511 |
| 0.7854166666666668 | 47.511 |
| 0.7861111111111111 | 47.511 |
| 0.7868055555555555 | 47.511 |
| 0.7875 | 47.511 |
| 0.7881944444444445 | 43.079 |
| 0.7888888888888889 | 43.079 |
| 0.7895833333333333 | 43.079 |
| 0.7902777777777777 | 43.079 |
| 0.7909722222222223 | 43.079 |
| 0.7916666666666666 | 43.079 |
| 0.7923611111111111 | 43.079 |
| 0.7930555555555556 | 38.653 |
| 0.7937500000000001 | 38.653 |
| 0.7944444444444444 | 38.653 |
| 0.7951388888888888 | 38.653 |
| 0.7958333333333334 | 38.653 |
| 0.7965277777777778 | 38.653 |
| 0.7972222222222222 | 38.653 |
| 0.7979166666666666 | 38.653 |
| 0.7986111111111112 | 38.653 |
| 0.7993055555555556 | 34.234 |
| 0.7999999999999999 | 34.234 |
| 0.8006944444444444 | 34.234 |
| 0.8013888888888889 | 34.234 |
| 0.8020833333333334 | 34.234 |
| 0.8027777777777777 | 34.234 |
| 0.8034722222222223 | 34.234 |
| 0.8041666666666667 | 29.823 |
| 0.8048611111111111 | 29.823 |
| 0.8055555555555555 | 29.823 |
| 0.80625 | 29.823 |
| 0.8069444444444445 | 29.823 |
| 0.8076388888888889 | 29.823 |
| 0.8083333333333332 | 29.823 |
| 0.8090277777777778 | 29.823 |
| 0.8097222222222222 | 29.823 |
| 0.8104166666666667 | 29.823 |
| 0.811111111111111 | 29.823 |
| 0.8118055555555556 | 25.419 |
| 0.8125 | 29.823 |
| 0.8131944444444444 | 25.419 |
| 0.813888888888889 | 25.419 |
| 0.8145833333333333 | 25.419 |
| 0.8152777777777778 | 25.419 |
| 0.8159722222222222 | 25.419 |
| 0.8166666666666668 | 25.419 |
| 0.8173611111111111 | 25.419 |
| 0.8180555555555555 | 21.024 |
| 0.81875 | 21.024 |
| 0.8194444444444445 | 21.024 |
| 0.8201388888888889 | 21.024 |
| 0.8208333333333333 | 21.024 |
| 0.8215277777777777 | 21.024 |
| 0.8222222222222223 | 21.024 |
| 0.8229166666666666 | 21.024 |
| 0.8236111111111111 | 16.636 |
| 0.8243055555555556 | 16.636 |
| 0.8250000000000001 | 16.636 |
| 0.8256944444444444 | 16.636 |
| 0.8263888888888888 | 16.636 |
| 0.8270833333333334 | 16.636 |
| 0.8277777777777778 | 16.636 |
| 0.8284722222222222 | 12.257 |
| 0.8291666666666666 | 12.257 |
| 0.8298611111111112 | 12.257 |
| 0.8305555555555556 | 12.257 |
| 0.8312499999999999 | 12.257 |
| 0.8319444444444444 | 12.257 |
| 0.8326388888888889 | 12.257 |
| 0.8333333333333334 | 12.257 |
| 0.8340277777777777 | 7.887 |
| 0.8347222222222223 | 7.887 |
| 0.8354166666666667 | 7.887 |
| 0.8361111111111111 | 7.887 |
| 0.8368055555555555 | 7.887 |
| 0.8375 | 7.887 |
| 0.8381944444444445 | 7.887 |
| 0.8388888888888889 | 3.525 |
| 0.8395833333333332 | 3.525 |
| 0.8402777777777778 | 3.525 |
| 0.8409722222222222 | 3.525 |
| 0.8416666666666667 | 3.525 |
| 0.842361111111111 | 3.525 |
| 0.8430555555555556 | 3.525 |
| 0.84375 | 3.525 |
| 0.8444444444444444 | 3.525 |
| 0.845138888888889 | 3.525 |
| 0.8458333333333333 | 0 |
| 0.8465277777777778 | 3.525 |
| 0.8472222222222222 | 0 |
| 0.8479166666666668 | 0 |
| 0.8486111111111111 | 0 |
| 0.8493055555555555 | 0 |
| 0.85 | 0 |
| 0.8506944444444445 | 0 |
| 0.8513888888888889 | 0 |
| 0.8520833333333333 | 0 |
| 0.8527777777777777 | 0 |
| 0.8534722222222223 | 0 |
| 0.8541666666666666 | 0 |
| 0.8548611111111111 | 0 |
| 0.8555555555555556 | 0 |
| 0.8562500000000001 | 0 |
| 0.8569444444444444 | 0 |
| 0.8576388888888888 | 0 |
| 0.8583333333333334 | 0 |
| 0.8590277777777778 | 0 |
| 0.8597222222222222 | 0 |
| 0.8604166666666666 | 0 |
| 0.8611111111111112 | 0 |
| 0.8618055555555556 | 0 |
| 0.8624999999999999 | 0 |
| 0.8631944444444444 | 0 |
| 0.8638888888888889 | 0 |
| 0.8645833333333334 | 0 |
| 0.8652777777777777 | 0 |
| 0.8659722222222223 | 0 |
| 0.8666666666666667 | 0 |
| 0.8673611111111111 | 0 |
| 0.8680555555555555 | 0 |
| 0.86875 | 0 |
| 0.8694444444444445 | 0 |
| 0.8701388888888889 | 0 |
| 0.8708333333333332 | 0 |
| 0.8715277777777778 | 0 |
| 0.8722222222222222 | 0 |
| 0.8729166666666667 | 0 |
| 0.873611111111111 | 0 |
| 0.8743055555555556 | 0 |
| 0.875 | 0 |
| 0.8756944444444444 | 0 |
| 0.876388888888889 | 0 |
| 0.8770833333333333 | 0 |
| 0.8777777777777778 | 0 |
| 0.8784722222222222 | 0 |
| 0.8791666666666668 | 0 |
| 0.8798611111111111 | 0 |
| 0.8805555555555555 | 0 |
| 0.88125 | 0 |
| 0.8819444444444445 | 0 |
| 0.8826388888888889 | 0 |
| 0.8833333333333333 | 0 |
| 0.8840277777777777 | 0 |
| 0.8847222222222223 | 0 |
| 0.8854166666666666 | 0 |
| 0.8861111111111111 | 0 |
| 0.8868055555555556 | 0 |
| 0.8875000000000001 | 0 |
| 0.8881944444444444 | 0 |
| 0.8888888888888888 | 0 |
| 0.8895833333333334 | 0 |
| 0.8902777777777778 | 0 |
| 0.8909722222222222 | 0 |
| 0.8916666666666666 | 0 |
| 0.8923611111111112 | 0 |
| 0.8930555555555556 | 0 |
| 0.8937499999999999 | 0 |
| 0.8944444444444444 | 0 |
| 0.8951388888888889 | 0 |
| 0.8958333333333334 | 0 |
| 0.8965277777777777 | 0 |
| 0.8972222222222223 | 0 |
| 0.8979166666666667 | 0 |
| 0.8986111111111111 | 0 |
| 0.8993055555555555 | 0 |
| 0.9 | 0 |
| 0.9006944444444445 | 0 |
| 0.9013888888888889 | 0 |
| 0.9020833333333332 | 0 |
| 0.9027777777777778 | 0 |
| 0.9034722222222222 | 0 |
| 0.9041666666666667 | 0 |
| 0.904861111111111 | 0 |
| 0.9055555555555556 | 0 |
| 0.90625 | 0 |
| 0.9069444444444444 | 0 |
| 0.907638888888889 | 0 |
| 0.9083333333333333 | 0 |
| 0.9090277777777778 | 0 |
| 0.9097222222222222 | 0 |
| 0.9104166666666668 | 0 |
| 0.9111111111111111 | 0 |
| 0.9118055555555555 | 0 |
| 0.9125 | 0 |
| 0.9131944444444445 | 0 |
| 0.9138888888888889 | 0 |
| 0.9145833333333333 | 0 |
| 0.9152777777777777 | 0 |
| 0.9159722222222223 | 0 |
| 0.9166666666666666 | 0 |
| 0.9173611111111111 | 0 |
| 0.9180555555555556 | 0 |
| 0.9187500000000001 | 0 |
| 0.9194444444444444 | 0 |
| 0.9201388888888888 | 0 |
| 0.9208333333333334 | 0 |
| 0.9215277777777778 | 0 |
| 0.9222222222222222 | 0 |
| 0.9229166666666666 | 0 |
| 0.9236111111111112 | 0 |
| 0.9243055555555556 | 0 |
| 0.9249999999999999 | 0 |
| 0.9256944444444444 | 0 |
| 0.9263888888888889 | 0 |
| 0.9270833333333334 | 0 |
| 0.9277777777777777 | 0 |
| 0.9284722222222223 | 0 |
| 0.9291666666666667 | 0 |
| 0.9298611111111111 | 0 |
| 0.9305555555555555 | 0 |
| 0.93125 | 0 |
| 0.9319444444444445 | 0 |
| 0.9326388888888889 | 0 |
| 0.9333333333333332 | 0 |
| 0.9340277777777778 | 0 |
| 0.9347222222222222 | 0 |
| 0.9354166666666667 | 0 |
| 0.936111111111111 | 0 |
| 0.9368055555555556 | 0 |
| 0.9375 | 0 |
| 0.9381944444444444 | 0 |
| 0.938888888888889 | 0 |
| 0.9395833333333333 | 0 |
| 0.9402777777777778 | 0 |
| 0.9409722222222222 | 0 |
| 0.9416666666666668 | 0 |
| 0.9423611111111111 | 0 |
| 0.9430555555555555 | 0 |
| 0.94375 | 0 |
| 0.9444444444444445 | 0 |
| 0.9451388888888889 | 0 |
| 0.9458333333333333 | 0 |
| 0.9465277777777777 | 0 |
| 0.9472222222222223 | 0 |
| 0.9479166666666666 | 0 |
| 0.9486111111111111 | 0 |
| 0.9493055555555556 | 0 |
| 0.9500000000000001 | 0 |
| 0.9506944444444444 | 0 |
| 0.9513888888888888 | 0 |
| 0.9520833333333334 | 0 |
| 0.9527777777777778 | 0 |
| 0.9534722222222222 | 0 |
| 0.9541666666666666 | 0 |
| 0.9548611111111112 | 0 |
| 0.9555555555555556 | 0 |
| 0.9562499999999999 | 0 |
| 0.9569444444444444 | 0 |
| 0.9576388888888889 | 0 |
| 0.9583333333333334 | 0 |
| 0.9590277777777777 | 0 |
| 0.9597222222222223 | 0 |
| 0.9604166666666667 | 0 |
| 0.9611111111111111 | 0 |
| 0.9618055555555555 | 0 |
| 0.9625 | 0 |
| 0.9631944444444445 | 0 |
| 0.9638888888888889 | 0 |
| 0.9645833333333332 | 0 |
| 0.9652777777777778 | 0 |
| 0.9659722222222222 | 0 |
| 0.9666666666666667 | 0 |
| 0.967361111111111 | 0 |
| 0.9680555555555556 | 0 |
| 0.96875 | 0 |
| 0.9694444444444444 | 0 |
| 0.970138888888889 | 0 |
| 0.9708333333333333 | 0 |
| 0.9715277777777778 | 0 |
| 0.9722222222222222 | 0 |
| 0.9729166666666668 | 0 |
| 0.9736111111111111 | 0 |
| 0.9743055555555555 | 0 |
| 0.975 | 0 |
| 0.9756944444444445 | 0 |
| 0.9763888888888889 | 0 |
| 0.9770833333333333 | 0 |
| 0.9777777777777777 | 0 |
| 0.9784722222222223 | 0 |
| 0.9791666666666666 | 0 |
| 0.9798611111111111 | 0 |
| 0.9805555555555556 | 0 |
| 0.9812500000000001 | 0 |
| 0.9819444444444444 | 0 |
| 0.9826388888888888 | 0 |
| 0.9833333333333334 | 0 |
| 0.9840277777777778 | 0 |
| 0.9847222222222222 | 0 |
| 0.9854166666666666 | 0 |
| 0.9861111111111112 | 0 |
| 0.9868055555555556 | 0 |
| 0.9874999999999999 | 0 |
| 0.9881944444444444 | 0 |
| 0.9888888888888889 | 0 |
| 0.9895833333333334 | 0 |
| 0.9902777777777777 | 0 |
| 0.9909722222222223 | 0 |
| 0.9916666666666667 | 0 |
| 0.9923611111111111 | 0 |
| 0.9930555555555555 | 0 |
| 0.99375 | 0 |
| 0.9944444444444445 | 0 |
| 0.9951388888888889 | 0 |
| 0.9958333333333332 | 0 |
| 0.9965277777777778 | 0 |
| 0.9972222222222222 | 0 |
| 0.9979166666666667 | 0 |
| 0.998611111111111 | 0 |
| 0.9993055555555556 | 0 |